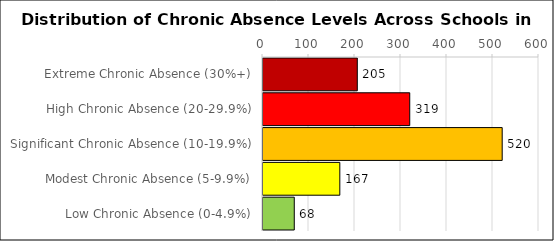
| Category | Number of Schools |
|---|---|
| Extreme Chronic Absence (30%+) | 205 |
| High Chronic Absence (20-29.9%) | 319 |
| Significant Chronic Absence (10-19.9%) | 520 |
| Modest Chronic Absence (5-9.9%) | 167 |
| Low Chronic Absence (0-4.9%) | 68 |